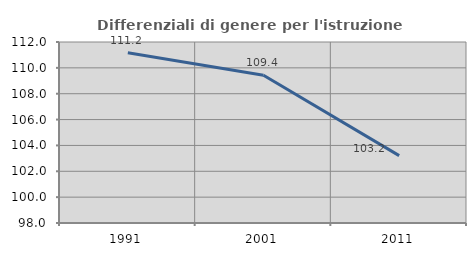
| Category | Differenziali di genere per l'istruzione superiore |
|---|---|
| 1991.0 | 111.17 |
| 2001.0 | 109.432 |
| 2011.0 | 103.211 |